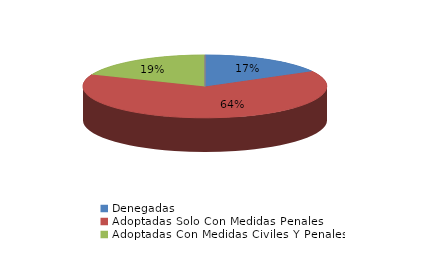
| Category | Series 0 |
|---|---|
| Denegadas | 9 |
| Adoptadas Solo Con Medidas Penales | 34 |
| Adoptadas Con Medidas Civiles Y Penales | 10 |
| Adoptadas Con Medidas Solo Civiles | 0 |